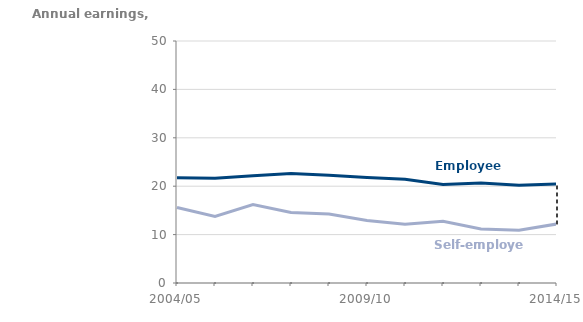
| Category | Employees | Self-employed |
|---|---|---|
| 2004/05 | 21723 | 15610 |
| 2005/06 | 21657 | 13755 |
| 2006/07 | 22179 | 16200 |
| 2007/08 | 22601 | 14587 |
| 2008/09 | 22280 | 14243 |
| 2009/10 | 21815 | 12906 |
| 2010/11 | 21412 | 12125 |
| 2011/12 | 20332 | 12736 |
| 2012/13 | 20679 | 11166 |
| 2013/14 | 20205 | 10911 |
| 2014/15 | 20448 | 12198 |